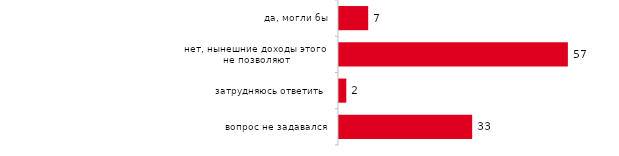
| Category | Series 0 |
|---|---|
| да, могли бы | 7.327 |
| нет, нынешние доходы этого не позволяют | 57.426 |
| затрудняюсь ответить | 1.832 |
| вопрос не задавался | 33.416 |